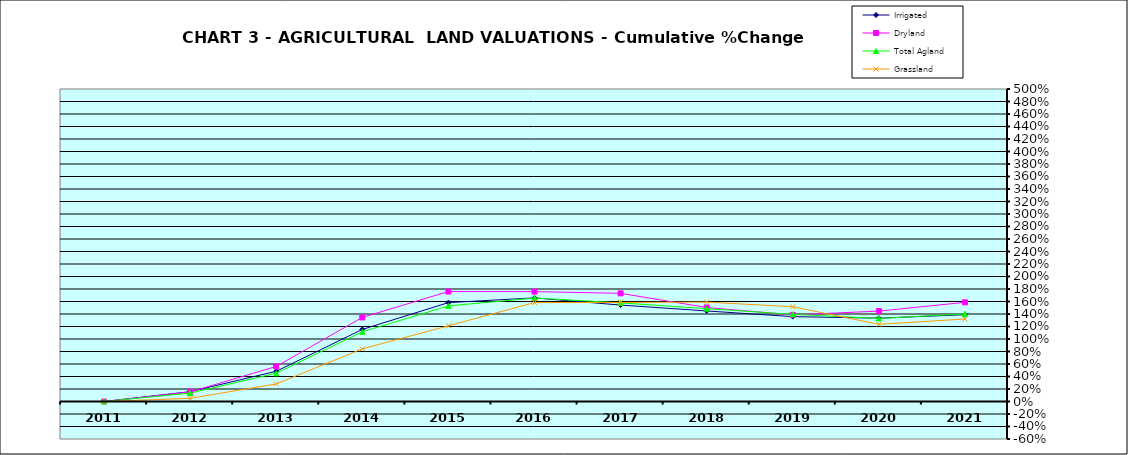
| Category | Irrigated | Dryland | Total Agland | Grassland |
|---|---|---|---|---|
| 2011.0 | 0 | 0 | 0 | 0 |
| 2012.0 | 0.157 | 0.153 | 0.134 | 0.05 |
| 2013.0 | 0.483 | 0.561 | 0.452 | 0.281 |
| 2014.0 | 1.153 | 1.345 | 1.115 | 0.842 |
| 2015.0 | 1.582 | 1.759 | 1.529 | 1.211 |
| 2016.0 | 1.658 | 1.758 | 1.656 | 1.583 |
| 2017.0 | 1.543 | 1.731 | 1.578 | 1.585 |
| 2018.0 | 1.449 | 1.504 | 1.486 | 1.591 |
| 2019.0 | 1.358 | 1.386 | 1.394 | 1.516 |
| 2020.0 | 1.333 | 1.446 | 1.328 | 1.235 |
| 2021.0 | 1.389 | 1.586 | 1.401 | 1.319 |